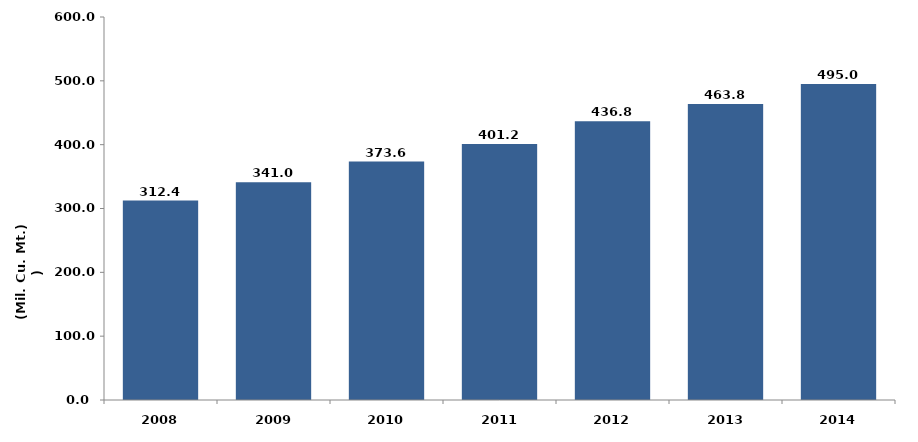
| Category |  انتاج المياه 
( مليون متر مكعب  ) Water Production
(Million Cubic Meters) |
|---|---|
| 2008 | 312.4 |
| 2009 | 341 |
| 2010 | 373.6 |
| 2011 | 401.2 |
| 2012 | 436.8 |
| 2013 | 463.8 |
| 2014 | 494.961 |